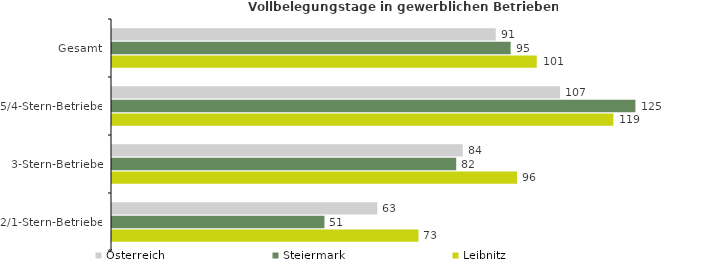
| Category | Österreich | Steiermark | Leibnitz |
|---|---|---|---|
| Gesamt | 91.375 | 94.907 | 101.129 |
| 5/4-Stern-Betriebe | 106.695 | 124.622 | 119.374 |
| 3-Stern-Betriebe | 83.508 | 81.957 | 96.431 |
| 2/1-Stern-Betriebe | 63.173 | 50.58 | 72.966 |